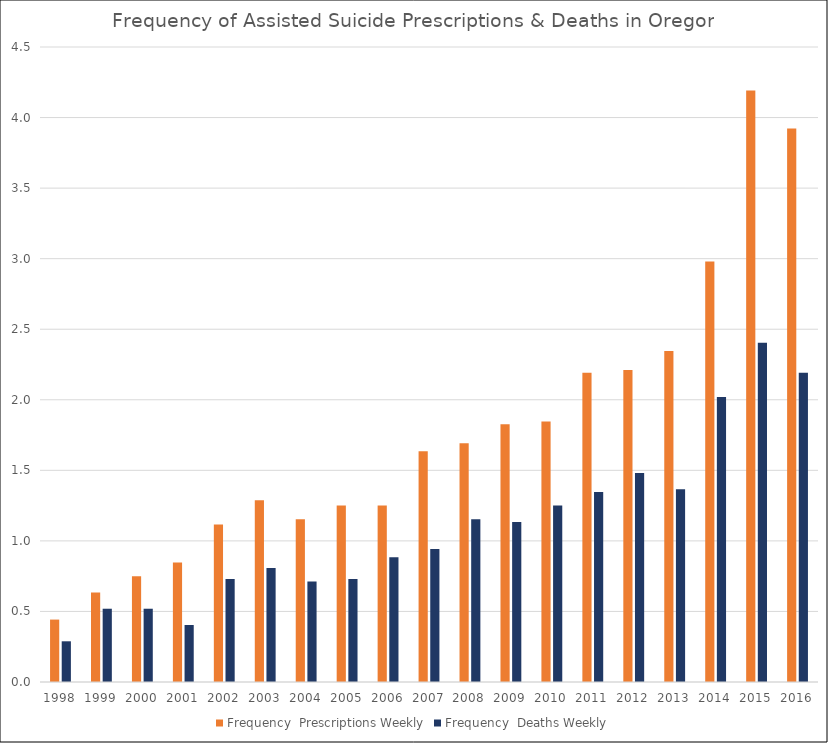
| Category | Frequency |
|---|---|
| 1998 | 0.288 |
| 1999 | 0.519 |
| 2000 | 0.519 |
| 2001 | 0.404 |
| 2002 | 0.731 |
| 2003 | 0.808 |
| 2004 | 0.712 |
| 2005 | 0.731 |
| 2006 | 0.885 |
| 2007 | 0.942 |
| 2008 | 1.154 |
| 2009 | 1.135 |
| 2010 | 1.25 |
| 2011 | 1.346 |
| 2012 | 1.481 |
| 2013 | 1.365 |
| 2014 | 2.019 |
| 2015 | 2.404 |
| 2016 | 2.192 |